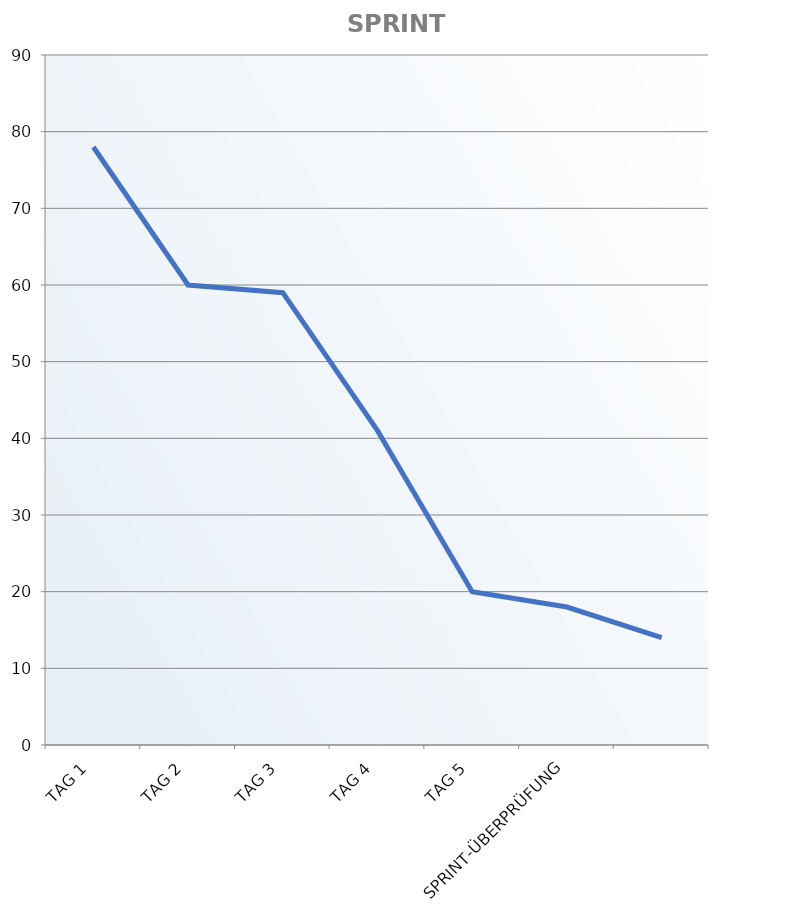
| Category | Sprint-Burndown-Diagramm |
|---|---|
| TAG 1 | 78 |
| TAG 2 | 60 |
| TAG 3 | 59 |
| TAG 4 | 41 |
| TAG 5 | 20 |
| SPRINT-ÜBERPRÜFUNG | 18 |